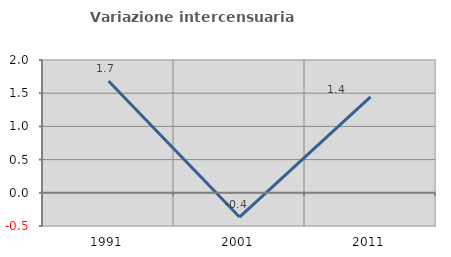
| Category | Variazione intercensuaria annua |
|---|---|
| 1991.0 | 1.685 |
| 2001.0 | -0.365 |
| 2011.0 | 1.445 |